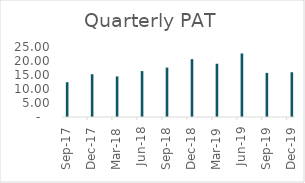
| Category | Net profit |
|---|---|
| 2017-09-30 | 12.42 |
| 2017-12-31 | 15.28 |
| 2018-03-31 | 14.49 |
| 2018-06-30 | 16.4 |
| 2018-09-30 | 17.65 |
| 2018-12-31 | 20.66 |
| 2019-03-31 | 19.02 |
| 2019-06-30 | 22.69 |
| 2019-09-30 | 15.75 |
| 2019-12-31 | 15.98 |